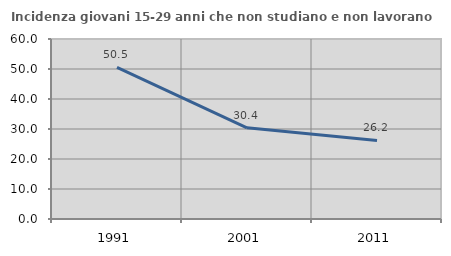
| Category | Incidenza giovani 15-29 anni che non studiano e non lavorano  |
|---|---|
| 1991.0 | 50.53 |
| 2001.0 | 30.4 |
| 2011.0 | 26.19 |